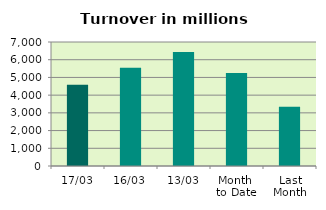
| Category | Series 0 |
|---|---|
| 17/03 | 4588.386 |
| 16/03 | 5543.864 |
| 13/03 | 6428.701 |
| Month 
to Date | 5244.174 |
| Last
Month | 3347.876 |